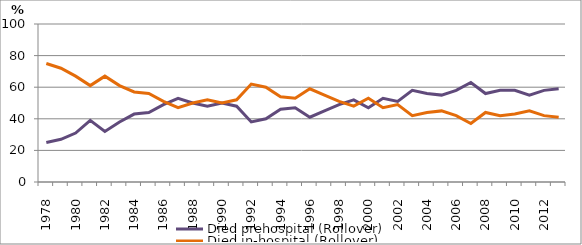
| Category | Died prehospital (Rollover) | Died in-hospital (Rollover) |
|---|---|---|
| 1978.0 | 25 | 75 |
| 1979.0 | 27 | 72 |
| 1980.0 | 31 | 67 |
| 1981.0 | 39 | 61 |
| 1982.0 | 32 | 67 |
| 1983.0 | 38 | 61 |
| 1984.0 | 43 | 57 |
| 1985.0 | 44 | 56 |
| 1986.0 | 49 | 51 |
| 1987.0 | 53 | 47 |
| 1988.0 | 50 | 50 |
| 1989.0 | 48 | 52 |
| 1990.0 | 50 | 50 |
| 1991.0 | 48 | 52 |
| 1992.0 | 38 | 62 |
| 1993.0 | 40 | 60 |
| 1994.0 | 46 | 54 |
| 1995.0 | 47 | 53 |
| 1996.0 | 41 | 59 |
| 1997.0 | 45 | 55 |
| 1998.0 | 49 | 51 |
| 1999.0 | 52 | 48 |
| 2000.0 | 47 | 53 |
| 2001.0 | 53 | 47 |
| 2002.0 | 51 | 49 |
| 2003.0 | 58 | 42 |
| 2004.0 | 56 | 44 |
| 2005.0 | 55 | 45 |
| 2006.0 | 58 | 42 |
| 2007.0 | 63 | 37 |
| 2008.0 | 56 | 44 |
| 2009.0 | 58 | 42 |
| 2010.0 | 58 | 43 |
| 2011.0 | 55 | 45 |
| 2012.0 | 58 | 42 |
| 2013.0 | 59 | 41 |